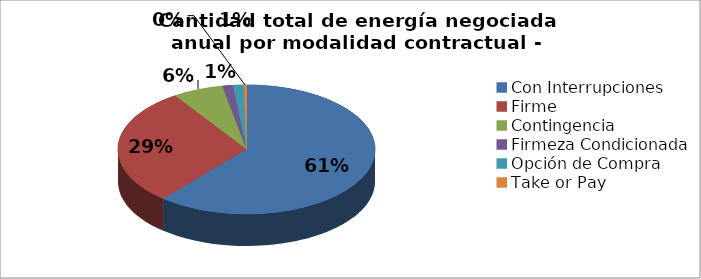
| Category | N° Contratos |
|---|---|
| Con Interrupciones | 1066945 |
| Firme | 513821 |
| Contingencia | 110226 |
| Firmeza Condicionada | 23391 |
| Opción de Compra | 23250 |
| Take or Pay | 6150 |